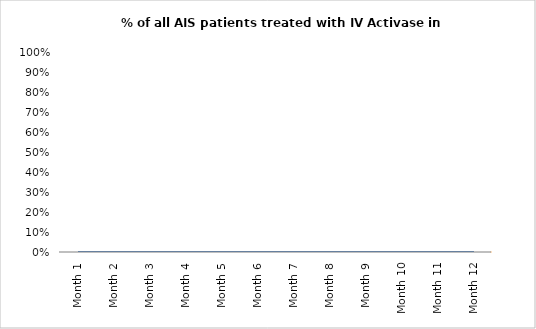
| Category | % of all AIS patients treated with IV Activase in ≤60 min |
|---|---|
| Month 1 | 0 |
| Month 2 | 0 |
| Month 3 | 0 |
| Month 4 | 0 |
| Month 5 | 0 |
| Month 6 | 0 |
| Month 7 | 0 |
| Month 8 | 0 |
| Month 9 | 0 |
| Month 10 | 0 |
| Month 11 | 0 |
| Month 12 | 0 |